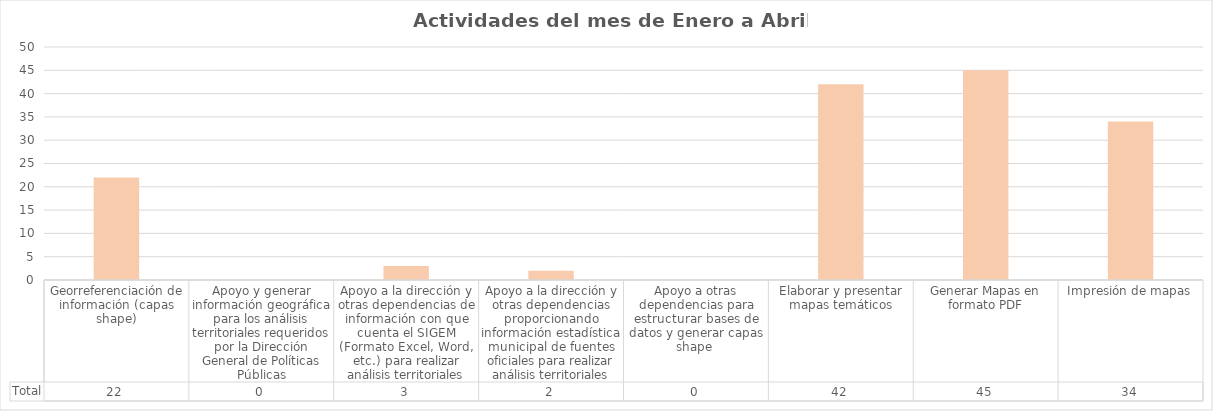
| Category | Total |
|---|---|
| Georreferenciación de información (capas shape) | 22 |
| Apoyo y generar información geográfica para los análisis territoriales requeridos por la Dirección General de Políticas Públicas | 0 |
| Apoyo a la dirección y otras dependencias de información con que cuenta el SIGEM (Formato Excel, Word, etc.) para realizar análisis territoriales | 3 |
| Apoyo a la dirección y otras dependencias proporcionando información estadística municipal de fuentes oficiales para realizar análisis territoriales | 2 |
| Apoyo a otras dependencias para estructurar bases de datos y generar capas shape  | 0 |
| Elaborar y presentar mapas temáticos | 42 |
| Generar Mapas en formato PDF | 45 |
| Impresión de mapas | 34 |